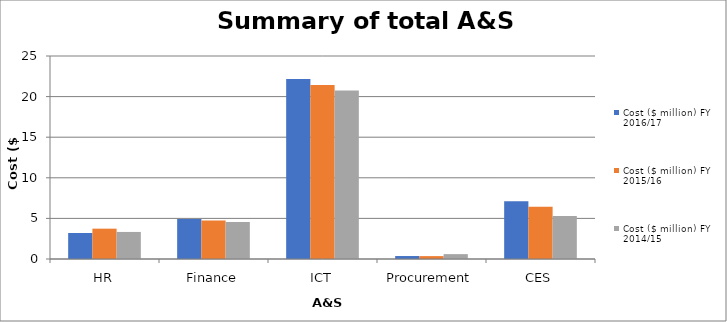
| Category | Cost ($ million) FY 2016/17 | Cost ($ million) FY 2015/16 | Cost ($ million) FY 2014/15 |
|---|---|---|---|
| HR | 3.205 | 3.736 | 3.332 |
| Finance | 4.921 | 4.75 | 4.572 |
| ICT | 22.165 | 21.436 | 20.748 |
| Procurement | 0.366 | 0.355 | 0.599 |
| CES | 7.106 | 6.447 | 5.307 |